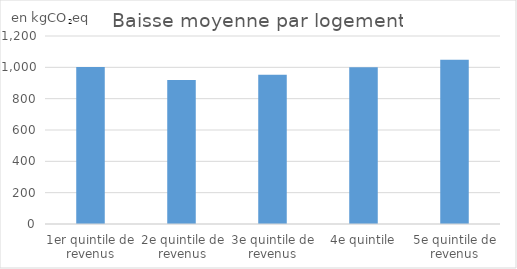
| Category | Baisse moyenne |
|---|---|
| 1er quintile de revenus | 1001.507 |
| 2e quintile de revenus | 919.029 |
| 3e quintile de revenus | 952.303 |
| 4e quintile | 1000.681 |
| 5e quintile de revenus | 1048.72 |